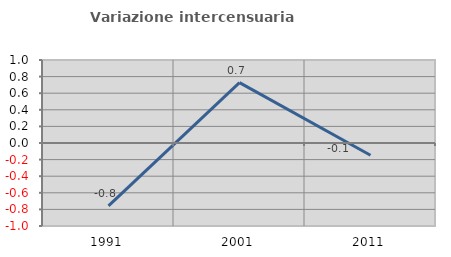
| Category | Variazione intercensuaria annua |
|---|---|
| 1991.0 | -0.758 |
| 2001.0 | 0.727 |
| 2011.0 | -0.148 |